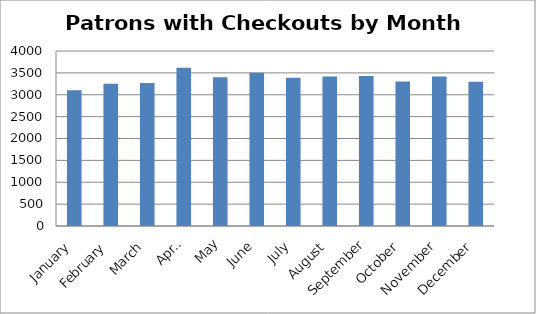
| Category | 3103 |
|---|---|
| January | 3103.129 |
| February | 3254.207 |
| March | 3269.065 |
| April | 3614.933 |
| May | 3399.226 |
| June | 3503.633 |
| July | 3390.484 |
| August | 3415.129 |
| September | 3425.733 |
| October | 3301.516 |
| November | 3415.133 |
| December | 3299.226 |